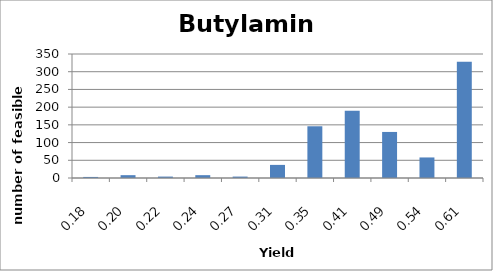
| Category | Butylamine |
|---|---|
| 0.1769 | 3 |
| 0.2013 | 8 |
| 0.2196 | 4 |
| 0.244 | 8 |
| 0.2684 | 4 |
| 0.305 | 37 |
| 0.3477 | 146 |
| 0.4087 | 190 |
| 0.488 | 130 |
| 0.5429 | 58 |
| 0.61 | 328 |